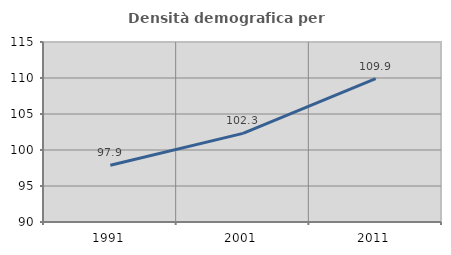
| Category | Densità demografica |
|---|---|
| 1991.0 | 97.875 |
| 2001.0 | 102.31 |
| 2011.0 | 109.907 |